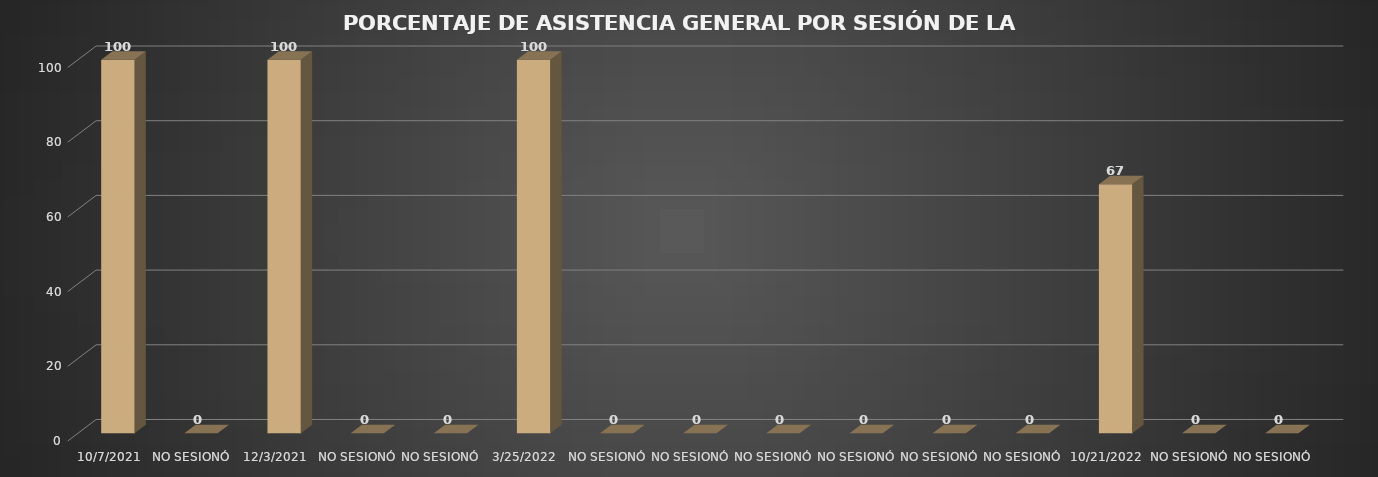
| Category | Series 0 |
|---|---|
| 07/10/2021 | 100 |
| NO SESIONÓ | 0 |
| 03/12/2021 | 100 |
| NO SESIONÓ | 0 |
| NO SESIONÓ | 0 |
| 25/03/2022 | 100 |
| NO SESIONÓ | 0 |
| NO SESIONÓ | 0 |
| NO SESIONÓ | 0 |
| NO SESIONÓ | 0 |
| NO SESIONÓ | 0 |
| NO SESIONÓ | 0 |
| 21/10/2022 | 66.667 |
| NO SESIONÓ | 0 |
| NO SESIONÓ | 0 |